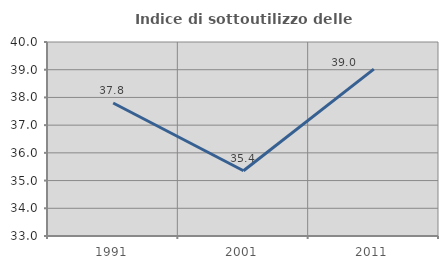
| Category | Indice di sottoutilizzo delle abitazioni  |
|---|---|
| 1991.0 | 37.799 |
| 2001.0 | 35.356 |
| 2011.0 | 39.022 |